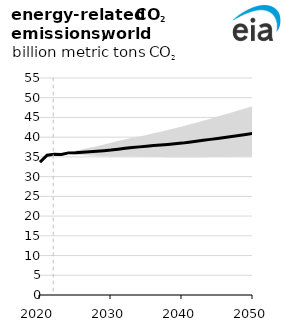
| Category | Series 1 |
|---|---|
| 2020.0 | 33664.458 |
| 2021.0 | 35420.411 |
| 2022.0 | 35669.344 |
| 2023.0 | 35599.144 |
| 2024.0 | 36023.018 |
| 2025.0 | 36052.615 |
| 2026.0 | 36165.614 |
| 2027.0 | 36300.922 |
| 2028.0 | 36414.154 |
| 2029.0 | 36556.365 |
| 2030.0 | 36725.619 |
| 2031.0 | 36943.317 |
| 2032.0 | 37187.802 |
| 2033.0 | 37367.278 |
| 2034.0 | 37543.44 |
| 2035.0 | 37723.98 |
| 2036.0 | 37873.259 |
| 2037.0 | 38019.012 |
| 2038.0 | 38170.274 |
| 2039.0 | 38325.615 |
| 2040.0 | 38496.621 |
| 2041.0 | 38726.257 |
| 2042.0 | 38964.073 |
| 2043.0 | 39199.237 |
| 2044.0 | 39442.002 |
| 2045.0 | 39685.437 |
| 2046.0 | 39930.246 |
| 2047.0 | 40189.074 |
| 2048.0 | 40442.416 |
| 2049.0 | 40696.237 |
| 2050.0 | 40953.806 |